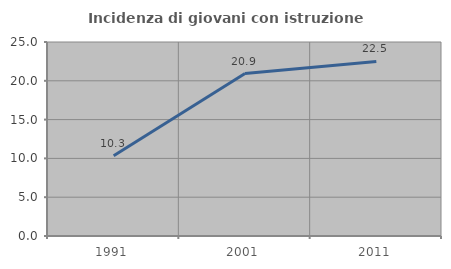
| Category | Incidenza di giovani con istruzione universitaria |
|---|---|
| 1991.0 | 10.345 |
| 2001.0 | 20.93 |
| 2011.0 | 22.5 |